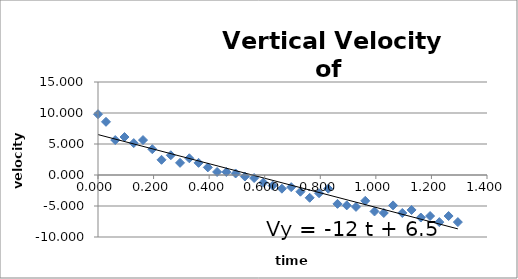
| Category | Series 0 |
|---|---|
| 0.0 | 9.802 |
| 0.02871111100000001 | 8.576 |
| 0.062033333000000024 | 5.636 |
| 0.09537777800000002 | 6.126 |
| 0.12868888899999997 | 5.146 |
| 0.16204444399999995 | 5.636 |
| 0.19534444400000006 | 4.166 |
| 0.228677778 | 2.45 |
| 0.262 | 3.185 |
| 0.295322222 | 1.96 |
| 0.32865555599999996 | 2.695 |
| 0.361977778 | 1.96 |
| 0.3953 | 1.225 |
| 0.42863333300000006 | 0.49 |
| 0.46195555599999993 | 0.49 |
| 0.4952888889999998 | 0.245 |
| 0.528611111 | -0.245 |
| 0.5619333329999998 | -0.49 |
| 0.5952666670000002 | -1.225 |
| 0.628588889 | -1.715 |
| 0.6619222219999998 | -2.205 |
| 0.6952555559999998 | -1.96 |
| 0.728566667 | -2.695 |
| 0.7618888890000002 | -3.676 |
| 0.7955333329999998 | -2.94 |
| 0.8285444439999998 | -2.205 |
| 0.8618777779999998 | -4.656 |
| 0.8952111110000001 | -4.901 |
| 0.9285333329999998 | -5.146 |
| 0.9618555560000002 | -4.166 |
| 0.995188889 | -5.881 |
| 1.0285222219999999 | -6.126 |
| 1.061888889 | -4.901 |
| 1.095177778 | -6.126 |
| 1.128511111 | -5.636 |
| 1.1618333330000001 | -6.861 |
| 1.195155556 | -6.616 |
| 1.2284777779999998 | -7.596 |
| 1.261811111 | -6.616 |
| 1.2951333329999999 | -7.596 |